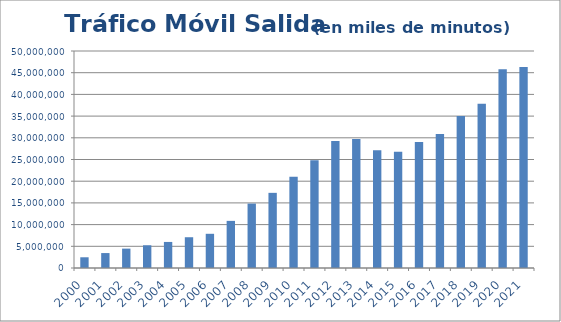
| Category | Tráfico Salida  en miles de minutos  |
|---|---|
| 2000 | 2471208.216 |
| 2001 | 3441736.145 |
| 2002 | 4464101.558 |
| 2003 | 5237945.688 |
| 2004 | 6003889.136 |
| 2005 | 7089121.671 |
| 2006 | 7881070.445 |
| 2007 | 10857829.097 |
| 2008 | 14842544.992 |
| 2009 | 17315937.37 |
| 2010 | 21012307.587 |
| 2011 | 24832335.384 |
| 2012 | 29284513.139 |
| 2013 | 29748487.795 |
| 2014 | 27120732.321 |
| 2015 | 26759882.276 |
| 2016 | 29023085.247 |
| 2017 | 30893589.798 |
| 2018 | 35010096.544 |
| 2019 | 37859939.438 |
| 2020 | 45771603.977 |
| 2021 | 46310695.599 |